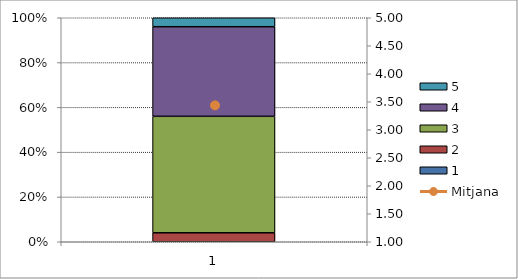
| Category | 1 | 2 | 3 | 4 | 5 |
|---|---|---|---|---|---|
| 0 | 0 | 1 | 13 | 10 | 1 |